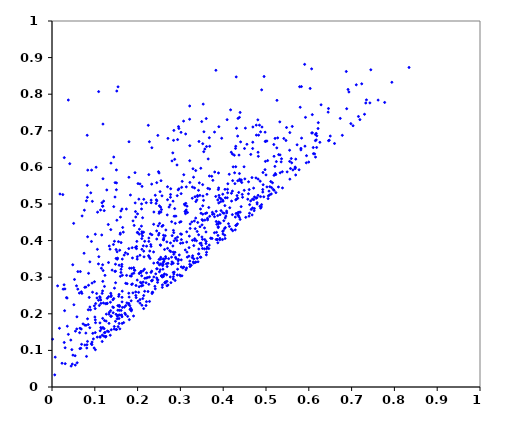
| Category | points |
|---|---|
| 0.14996600822938988 | 0.157 |
| 0.2538519331123644 | 0.387 |
| 0.33609830445176325 | 0.342 |
| 0.2009649696138185 | 0.556 |
| 0.10571911536144574 | 0.136 |
| 0.3006571428754381 | 0.304 |
| 0.09537257589368375 | 0.147 |
| 0.38746721742461077 | 0.394 |
| 0.5693814164976251 | 0.579 |
| 0.4378885634009636 | 0.583 |
| 0.5187987745960927 | 0.63 |
| 0.190539270114235 | 0.194 |
| 0.3620900134724797 | 0.526 |
| 0.2934849191602191 | 0.676 |
| 0.4574336012602498 | 0.513 |
| 0.22433203431825288 | 0.261 |
| 0.3522466488907272 | 0.665 |
| 0.23796214162603224 | 0.301 |
| 0.25100240692735687 | 0.315 |
| 0.028571211504298866 | 0.122 |
| 0.24729764003446741 | 0.687 |
| 0.4930083259814646 | 0.586 |
| 0.2342578447388438 | 0.259 |
| 0.296603717109026 | 0.541 |
| 0.231443041877467 | 0.384 |
| 0.09245658043074745 | 0.593 |
| 0.23806443718799575 | 0.478 |
| 0.25455858450280777 | 0.478 |
| 0.4979004457194802 | 0.696 |
| 0.08846284306278995 | 0.342 |
| 0.2317277293326614 | 0.504 |
| 0.5295581149846709 | 0.635 |
| 0.16304407737390536 | 0.329 |
| 0.5111018335146779 | 0.561 |
| 0.083589409945514 | 0.593 |
| 0.5182498111121585 | 0.663 |
| 0.3545333489110396 | 0.643 |
| 0.31477592328699033 | 0.424 |
| 0.33744879963457797 | 0.4 |
| 0.3758567424485221 | 0.565 |
| 0.4293126307478341 | 0.441 |
| 0.28228585160510244 | 0.64 |
| 0.513050007340022 | 0.545 |
| 0.2501905055678574 | 0.42 |
| 0.4875637987235829 | 0.489 |
| 0.36773824066127414 | 0.576 |
| 0.32776803869283433 | 0.516 |
| 0.20492507264218007 | 0.312 |
| 0.48210220283564686 | 0.63 |
| 0.49773014670859783 | 0.594 |
| 0.16109412726416128 | 0.481 |
| 0.27669788032085785 | 0.518 |
| 0.39953877044020825 | 0.418 |
| 0.17497784255116167 | 0.23 |
| 0.4925439163522779 | 0.533 |
| 0.3603654317188498 | 0.733 |
| 0.11160236608068308 | 0.247 |
| 0.7302109508781169 | 0.745 |
| 0.43092616774813464 | 0.442 |
| 0.02344858550452411 | 0.065 |
| 0.22850421948433952 | 0.371 |
| 0.3330610549169313 | 0.544 |
| 0.13378544964899042 | 0.385 |
| 0.258474266413254 | 0.332 |
| 0.5362997622574449 | 0.624 |
| 0.49487222072624837 | 0.52 |
| 0.12903134780387593 | 0.242 |
| 0.21333302386924358 | 0.386 |
| 0.48151889183177676 | 0.524 |
| 0.22682266937573414 | 0.356 |
| 0.3093470378987012 | 0.5 |
| 0.5827526713866171 | 0.821 |
| 0.538532206465129 | 0.544 |
| 0.24661332650902779 | 0.286 |
| 0.37976843125511794 | 0.697 |
| 0.007485824559324783 | 0.082 |
| 0.2955771497326545 | 0.711 |
| 0.2158642872986063 | 0.322 |
| 0.42215185414747014 | 0.427 |
| 0.4688089982400281 | 0.652 |
| 0.1543302035512688 | 0.82 |
| 0.08468084175842161 | 0.171 |
| 0.2036490996968927 | 0.418 |
| 0.14045098395075273 | 0.319 |
| 0.2852852743110823 | 0.399 |
| 0.4002132924881734 | 0.427 |
| 0.0936084434261304 | 0.284 |
| 0.3931002518734388 | 0.448 |
| 0.3797211094027986 | 0.465 |
| 0.16111927943620497 | 0.313 |
| 0.3405603657170908 | 0.45 |
| 0.43696282324866464 | 0.634 |
| 0.35033866737428676 | 0.41 |
| 0.6876360758077845 | 0.862 |
| 0.6174245048818664 | 0.693 |
| 0.4982516791558036 | 0.671 |
| 0.25777405396302344 | 0.272 |
| 0.5231506997926735 | 0.531 |
| 0.3527224671876258 | 0.522 |
| 0.6173569231581106 | 0.675 |
| 0.22019228114409128 | 0.298 |
| 0.14976805826960415 | 0.376 |
| 0.0173974376215017 | 0.16 |
| 0.18498840512994796 | 0.235 |
| 0.1580900879261301 | 0.197 |
| 0.24132429410757994 | 0.268 |
| 0.28355498085166175 | 0.301 |
| 0.14366126465856177 | 0.217 |
| 0.29287014407291445 | 0.306 |
| 0.6154292447277989 | 0.673 |
| 0.2920835279245402 | 0.607 |
| 0.06911182047724884 | 0.117 |
| 0.1532161205572694 | 0.352 |
| 0.4672547867016811 | 0.572 |
| 0.4644715333388355 | 0.636 |
| 0.529019307121444 | 0.547 |
| 0.28039796971519504 | 0.618 |
| 0.3228715466911438 | 0.445 |
| 0.43126287769595417 | 0.513 |
| 0.20795288796281441 | 0.313 |
| 0.32157086219975073 | 0.732 |
| 0.14425781829658146 | 0.493 |
| 0.4016710231272145 | 0.475 |
| 0.2447505099867191 | 0.558 |
| 0.2710457780135479 | 0.338 |
| 0.3219825589856614 | 0.659 |
| 0.11252656270175287 | 0.154 |
| 0.27736931408626286 | 0.542 |
| 0.09842685165032494 | 0.107 |
| 0.2556986117712693 | 0.304 |
| 0.479200768491052 | 0.504 |
| 0.3281291424017698 | 0.546 |
| 0.2793597857009733 | 0.355 |
| 0.22097326541977258 | 0.385 |
| 0.6135941921173391 | 0.637 |
| 0.13610744043025713 | 0.141 |
| 0.17153659098717455 | 0.367 |
| 0.24506375077403997 | 0.509 |
| 0.23291082793572537 | 0.554 |
| 0.05479270683521187 | 0.153 |
| 0.22625197883941073 | 0.58 |
| 0.13737673052646548 | 0.43 |
| 0.09426174301821844 | 0.507 |
| 0.5021937041778373 | 0.547 |
| 0.12266042160764046 | 0.182 |
| 0.3326297324584715 | 0.454 |
| 0.4714810104029723 | 0.512 |
| 0.028232498601921563 | 0.279 |
| 0.08043029554065495 | 0.509 |
| 0.14961586915919733 | 0.199 |
| 0.32175953229147447 | 0.335 |
| 0.2604247452192545 | 0.302 |
| 0.419213902729767 | 0.529 |
| 0.40818229762765934 | 0.476 |
| 0.3042243572430803 | 0.562 |
| 0.06828029336429553 | 0.158 |
| 0.48723723981365785 | 0.52 |
| 0.31282531266446845 | 0.32 |
| 0.11440353553556104 | 0.228 |
| 0.35230769089130043 | 0.472 |
| 0.1685655537288988 | 0.36 |
| 0.5997880061292808 | 0.615 |
| 0.4346457215725953 | 0.734 |
| 0.28039602401115915 | 0.342 |
| 0.5054807804196786 | 0.522 |
| 0.6478169687771119 | 0.674 |
| 0.36736946304772533 | 0.388 |
| 0.4772512473893231 | 0.715 |
| 0.5208517384615723 | 0.603 |
| 0.05724576740907816 | 0.276 |
| 0.08062820106371382 | 0.084 |
| 0.12504304918621445 | 0.137 |
| 0.15572866921925332 | 0.222 |
| 0.30743694176443837 | 0.727 |
| 0.4172912306206542 | 0.757 |
| 0.5242519457701105 | 0.616 |
| 0.3829316377470705 | 0.865 |
| 0.38843998831038906 | 0.438 |
| 0.13698011236676655 | 0.209 |
| 0.11912792564782515 | 0.569 |
| 0.2794023611807529 | 0.336 |
| 0.4340005783827058 | 0.516 |
| 0.27350201155900833 | 0.492 |
| 0.17698136404027542 | 0.363 |
| 0.28868271214233454 | 0.354 |
| 0.1840566293879804 | 0.215 |
| 0.16510093232706335 | 0.436 |
| 0.01308267904441518 | 0.276 |
| 0.09058693781296834 | 0.531 |
| 0.4376070116024632 | 0.464 |
| 0.09362233489698835 | 0.123 |
| 0.1595646197860877 | 0.42 |
| 0.6287059838826511 | 0.771 |
| 0.31135939913331945 | 0.374 |
| 0.6501108131502034 | 0.686 |
| 0.25067120514251573 | 0.479 |
| 0.20919753167975708 | 0.486 |
| 0.28394959755266747 | 0.674 |
| 0.21140311489142405 | 0.413 |
| 0.2080161411442779 | 0.316 |
| 0.4433617150965308 | 0.559 |
| 0.5038326898617792 | 0.619 |
| 0.34811610905790935 | 0.475 |
| 0.4641449592287379 | 0.508 |
| 0.20296332676292828 | 0.513 |
| 0.1957210581220219 | 0.464 |
| 0.06390591765095321 | 0.257 |
| 0.3476868413886317 | 0.598 |
| 0.10197468867908355 | 0.228 |
| 0.2334700322827058 | 0.416 |
| 0.6084431143728777 | 0.694 |
| 0.2094881632938792 | 0.304 |
| 0.27592715881438956 | 0.498 |
| 0.3549507202928982 | 0.697 |
| 0.2593723015995699 | 0.442 |
| 0.1295616087288911 | 0.153 |
| 0.1320796740414888 | 0.34 |
| 0.06845962870203526 | 0.26 |
| 0.364884546215414 | 0.623 |
| 0.4214309017788761 | 0.471 |
| 0.09201651659490417 | 0.118 |
| 0.5331562476351279 | 0.585 |
| 0.08475738611665096 | 0.211 |
| 0.4730805581709502 | 0.519 |
| 0.17241533181297974 | 0.222 |
| 0.36023496180439496 | 0.398 |
| 0.4518337660270668 | 0.707 |
| 0.2846387977249494 | 0.363 |
| 0.361120361771048 | 0.368 |
| 0.4452874862634767 | 0.518 |
| 0.26879860961329705 | 0.277 |
| 0.5211778549961676 | 0.679 |
| 0.2129570847619241 | 0.318 |
| 0.20596241145523064 | 0.229 |
| 0.3432199848959919 | 0.364 |
| 0.5590791300845208 | 0.624 |
| 0.4691452606533786 | 0.669 |
| 0.3731996318610822 | 0.576 |
| 0.19739563339635768 | 0.378 |
| 0.761980694556799 | 0.784 |
| 0.6452295133497216 | 0.751 |
| 0.11232485806975212 | 0.136 |
| 0.24458070741729754 | 0.426 |
| 0.22631642813980168 | 0.281 |
| 0.3641072732034668 | 0.543 |
| 0.20906521276242707 | 0.284 |
| 0.235247615220622 | 0.259 |
| 0.14348361660819908 | 0.389 |
| 0.5941369232376887 | 0.613 |
| 0.4350652028749128 | 0.469 |
| 0.15824381707817747 | 0.374 |
| 0.5252697020216937 | 0.653 |
| 0.24478119293845302 | 0.323 |
| 0.43958862570236357 | 0.75 |
| 0.4618119830830314 | 0.498 |
| 0.2983119808115534 | 0.45 |
| 0.3342562306116337 | 0.52 |
| 0.0063886593850018825 | 0.033 |
| 0.38364698297405 | 0.403 |
| 0.1576024847503824 | 0.22 |
| 0.27502847945359177 | 0.372 |
| 0.13153350374263317 | 0.444 |
| 0.26056606029987117 | 0.415 |
| 0.05057948929888145 | 0.447 |
| 0.20998507382748466 | 0.376 |
| 0.28831708511396037 | 0.406 |
| 0.35056721278842906 | 0.443 |
| 0.3469938590049556 | 0.486 |
| 0.12376653666409976 | 0.305 |
| 0.3402006754047566 | 0.521 |
| 0.7194317752357984 | 0.731 |
| 0.37945934179633545 | 0.421 |
| 0.29438938252933156 | 0.337 |
| 0.07660228223139565 | 0.272 |
| 0.03580133545353592 | 0.166 |
| 0.3301267047438732 | 0.342 |
| 0.06730623422265314 | 0.106 |
| 0.18532528828043215 | 0.208 |
| 0.20423892010926425 | 0.431 |
| 0.1094729437450983 | 0.356 |
| 0.3253264947978418 | 0.333 |
| 0.3144580994822833 | 0.325 |
| 0.5416970925704847 | 0.679 |
| 0.12655857845439056 | 0.18 |
| 0.2633459280482945 | 0.285 |
| 0.25379014971009106 | 0.491 |
| 0.5169542831014907 | 0.54 |
| 0.07495303001829534 | 0.365 |
| 0.5773474812402631 | 0.593 |
| 0.3357956243342285 | 0.591 |
| 0.2683598480587487 | 0.396 |
| 0.29543066070130153 | 0.349 |
| 0.3872638226470918 | 0.511 |
| 0.24666167293338448 | 0.34 |
| 0.22075791177724746 | 0.233 |
| 0.0651768204906168 | 0.105 |
| 0.1486014210730392 | 0.285 |
| 0.16143282993216002 | 0.322 |
| 0.18322663473175926 | 0.524 |
| 0.2672978166733986 | 0.337 |
| 0.12122038171832772 | 0.139 |
| 0.1523406125015202 | 0.187 |
| 0.2853662537118167 | 0.467 |
| 0.23261733491906345 | 0.29 |
| 0.4189158080845361 | 0.641 |
| 0.14597973760938743 | 0.27 |
| 0.18560638686497644 | 0.325 |
| 0.32684226188476573 | 0.451 |
| 0.10091476688532908 | 0.214 |
| 0.34238478872756306 | 0.364 |
| 0.693772982233414 | 0.806 |
| 0.2598513514002936 | 0.35 |
| 0.25807374932466365 | 0.279 |
| 0.22756306789214398 | 0.67 |
| 0.34550952327674334 | 0.524 |
| 0.48966367792814236 | 0.498 |
| 0.19942674318953257 | 0.422 |
| 0.3430702841113137 | 0.377 |
| 0.14828212822768783 | 0.336 |
| 0.12200410910706794 | 0.482 |
| 0.21429567623497026 | 0.371 |
| 0.35708443957018476 | 0.65 |
| 0.05881517094074873 | 0.066 |
| 0.8342433083506913 | 0.873 |
| 0.2692534086923667 | 0.47 |
| 0.07920242507526498 | 0.273 |
| 0.16422967904922958 | 0.349 |
| 0.40391769436403324 | 0.496 |
| 0.5726654162104712 | 0.662 |
| 0.3411798170969841 | 0.342 |
| 0.7236756091779756 | 0.828 |
| 0.4729133387976636 | 0.488 |
| 0.11909497089580012 | 0.718 |
| 0.14705557513076284 | 0.316 |
| 0.1599036444393439 | 0.464 |
| 0.39128907406741065 | 0.517 |
| 0.1504883064628758 | 0.593 |
| 0.3684762257365467 | 0.466 |
| 0.27002839765133857 | 0.379 |
| 0.2375077195956372 | 0.445 |
| 0.08293689246184699 | 0.125 |
| 0.18023554685684418 | 0.246 |
| 0.27626480312828305 | 0.301 |
| 0.5328639554902528 | 0.634 |
| 0.581674161233635 | 0.652 |
| 0.2540677211320439 | 0.354 |
| 0.5187492597638299 | 0.578 |
| 0.11541634354235675 | 0.324 |
| 0.05117214086648281 | 0.225 |
| 0.4283433063171409 | 0.464 |
| 0.2510047197223968 | 0.334 |
| 0.6982237720762111 | 0.72 |
| 0.21399411008084235 | 0.423 |
| 0.19628085057598732 | 0.277 |
| 0.21018697787987195 | 0.223 |
| 0.36635047869455917 | 0.378 |
| 0.4827119765310196 | 0.688 |
| 0.3615467097108007 | 0.476 |
| 0.3426428242016256 | 0.416 |
| 0.42666401360710104 | 0.585 |
| 0.04152207460777346 | 0.61 |
| 0.2334016387596407 | 0.29 |
| 0.11841607361993067 | 0.187 |
| 0.16274232879037553 | 0.197 |
| 0.23164843597954043 | 0.511 |
| 0.606760714277421 | 0.694 |
| 0.4864754017152786 | 0.562 |
| 0.3442068387769721 | 0.558 |
| 0.2725499226605924 | 0.351 |
| 0.09666676645989591 | 0.131 |
| 0.4592749306708722 | 0.561 |
| 0.2120300873543356 | 0.277 |
| 0.5599984316434743 | 0.613 |
| 0.6783316312325527 | 0.688 |
| 0.5558080922514009 | 0.568 |
| 0.20672744160412193 | 0.286 |
| 0.3003065626841468 | 0.393 |
| 0.35160020399052305 | 0.378 |
| 0.02945105671685111 | 0.209 |
| 0.3570729923090875 | 0.403 |
| 0.710997778712924 | 0.826 |
| 0.3675536903652151 | 0.681 |
| 0.14434152004141176 | 0.242 |
| 0.1483968887584457 | 0.316 |
| 0.07676335904566212 | 0.169 |
| 0.13560929833091573 | 0.377 |
| 0.22626289603668714 | 0.398 |
| 0.4770498493291323 | 0.516 |
| 0.49860651100117537 | 0.616 |
| 0.15159211290144115 | 0.456 |
| 0.23385505541869855 | 0.255 |
| 0.25467310476163973 | 0.564 |
| 0.01864660410457053 | 0.527 |
| 0.4232919605240424 | 0.602 |
| 0.03825110070807103 | 0.144 |
| 0.23455922502024473 | 0.292 |
| 0.22757321630760463 | 0.3 |
| 0.27103195657534684 | 0.279 |
| 0.2608427675831614 | 0.402 |
| 0.5552236989439608 | 0.616 |
| 0.17968935670063058 | 0.573 |
| 0.32254917592774424 | 0.329 |
| 0.40440351319429824 | 0.406 |
| 0.691708570550259 | 0.813 |
| 0.1474736578494028 | 0.558 |
| 0.16350016563243086 | 0.192 |
| 0.38512293150271426 | 0.445 |
| 0.43038933539453295 | 0.847 |
| 0.26112449509410396 | 0.407 |
| 0.484745182552237 | 0.715 |
| 0.44981765326312295 | 0.652 |
| 0.15935189422096718 | 0.417 |
| 0.1201008222639226 | 0.23 |
| 0.3633397482591113 | 0.461 |
| 0.1806693849227261 | 0.184 |
| 0.3384951067588299 | 0.511 |
| 0.26299504878478663 | 0.376 |
| 0.3350117235784734 | 0.341 |
| 0.3890038813212391 | 0.585 |
| 0.3989310292200353 | 0.51 |
| 0.048968313528171215 | 0.087 |
| 0.44193265559425443 | 0.493 |
| 0.10429298863210357 | 0.255 |
| 0.19358539985242262 | 0.319 |
| 0.48908803771225906 | 0.492 |
| 0.5217463253359915 | 0.583 |
| 0.03021514827992189 | 0.268 |
| 0.25975420766289137 | 0.335 |
| 0.17994571782627966 | 0.67 |
| 0.4898162114210304 | 0.812 |
| 0.35405639948600875 | 0.51 |
| 0.16662520430008632 | 0.423 |
| 0.33620643747792545 | 0.507 |
| 0.38259801535964666 | 0.521 |
| 0.3023120707745436 | 0.403 |
| 0.733155076366055 | 0.776 |
| 0.12253664539895315 | 0.148 |
| 0.435135545850313 | 0.477 |
| 0.1859907489386372 | 0.211 |
| 0.1568395304388036 | 0.333 |
| 0.11874270506681728 | 0.289 |
| 0.578609288204905 | 0.82 |
| 0.13221461502868992 | 0.247 |
| 0.24901379921277456 | 0.415 |
| 0.461388358667118 | 0.475 |
| 0.265050539099422 | 0.287 |
| 0.15078843986155044 | 0.157 |
| 0.39500181208373464 | 0.482 |
| 0.19933650662967717 | 0.356 |
| 0.13389959469095924 | 0.204 |
| 0.5799170528881848 | 0.764 |
| 0.28068157933447346 | 0.414 |
| 0.36102975183550357 | 0.657 |
| 0.3837382745352248 | 0.48 |
| 0.2646567701064235 | 0.413 |
| 0.07946962364929555 | 0.169 |
| 0.40407806250596845 | 0.54 |
| 0.2597622526068304 | 0.34 |
| 0.439524558004188 | 0.458 |
| 0.2834366358418756 | 0.313 |
| 0.2934478964636321 | 0.322 |
| 0.18796869037740793 | 0.353 |
| 0.2539532714604663 | 0.336 |
| 0.0013390045108441218 | 0.131 |
| 0.1423996226553782 | 0.238 |
| 0.469387145657274 | 0.71 |
| 0.5256270208597922 | 0.783 |
| 0.06994864566643122 | 0.256 |
| 0.4906498383322091 | 0.71 |
| 0.2832530125283296 | 0.338 |
| 0.16441404174272123 | 0.217 |
| 0.515123348008718 | 0.558 |
| 0.34655393211335994 | 0.355 |
| 0.2298182978397788 | 0.418 |
| 0.434993018982469 | 0.468 |
| 0.3395573160468499 | 0.351 |
| 0.09471651042537166 | 0.259 |
| 0.1557872544290715 | 0.248 |
| 0.4293076389107603 | 0.602 |
| 0.13835078282686808 | 0.251 |
| 0.41087920818017243 | 0.555 |
| 0.1120790425008924 | 0.175 |
| 0.4273922984350975 | 0.556 |
| 0.04638308761324561 | 0.102 |
| 0.31269695898096084 | 0.502 |
| 0.11403634856330047 | 0.162 |
| 0.35627271697519725 | 0.378 |
| 0.4765809065486014 | 0.571 |
| 0.20007532100019276 | 0.422 |
| 0.387762384388894 | 0.414 |
| 0.24131908192933693 | 0.524 |
| 0.3990117953127813 | 0.527 |
| 0.17425578254053864 | 0.305 |
| 0.42932154127232036 | 0.658 |
| 0.6461051514162804 | 0.673 |
| 0.10899507416641652 | 0.807 |
| 0.089880569889498 | 0.211 |
| 0.1637006603380381 | 0.245 |
| 0.3571174791859122 | 0.456 |
| 0.18232903719368954 | 0.212 |
| 0.1951059449160183 | 0.381 |
| 0.3626892165356409 | 0.382 |
| 0.7940995016159771 | 0.833 |
| 0.07254557457638777 | 0.172 |
| 0.43714056238464916 | 0.478 |
| 0.3884419963202179 | 0.447 |
| 0.32171727629554836 | 0.768 |
| 0.20987030994016265 | 0.419 |
| 0.5272670513877347 | 0.681 |
| 0.37472715740397733 | 0.477 |
| 0.31554512178172733 | 0.494 |
| 0.08138064304889492 | 0.107 |
| 0.33997649377350925 | 0.523 |
| 0.645924487285831 | 0.761 |
| 0.26862285844169675 | 0.289 |
| 0.5556981236841183 | 0.695 |
| 0.20977684500725868 | 0.405 |
| 0.1139025767672256 | 0.238 |
| 0.1379783106636896 | 0.247 |
| 0.396472190515581 | 0.68 |
| 0.34840403665536035 | 0.393 |
| 0.12418167929406554 | 0.149 |
| 0.1553283043365673 | 0.397 |
| 0.26015058919206924 | 0.402 |
| 0.25271469992468354 | 0.32 |
| 0.6187506121599362 | 0.687 |
| 0.25384131648549924 | 0.349 |
| 0.3056297052004716 | 0.394 |
| 0.3663143704467787 | 0.49 |
| 0.33132464586457555 | 0.35 |
| 0.044677659633771905 | 0.057 |
| 0.10850925167927872 | 0.336 |
| 0.404990053616224 | 0.436 |
| 0.37150499386847013 | 0.407 |
| 0.4140959107764788 | 0.581 |
| 0.48169651946612446 | 0.568 |
| 0.1955792627295695 | 0.26 |
| 0.47874648014400256 | 0.517 |
| 0.05448934707407027 | 0.06 |
| 0.34579254874835075 | 0.438 |
| 0.3282313075837874 | 0.401 |
| 0.21646944060363382 | 0.261 |
| 0.39196211368208833 | 0.402 |
| 0.14291580838065354 | 0.203 |
| 0.6156845102466454 | 0.628 |
| 0.18730274813166203 | 0.309 |
| 0.5922717681237832 | 0.737 |
| 0.3925190714966119 | 0.471 |
| 0.08171549445676884 | 0.115 |
| 0.25576146671009814 | 0.485 |
| 0.7159845122565178 | 0.739 |
| 0.30150844885289796 | 0.696 |
| 0.17677065966111616 | 0.193 |
| 0.10873304940868 | 0.237 |
| 0.32774445378171035 | 0.354 |
| 0.15457319252040702 | 0.196 |
| 0.10603695613158348 | 0.376 |
| 0.03083177207560106 | 0.064 |
| 0.331291403988221 | 0.386 |
| 0.1991265916669358 | 0.349 |
| 0.3596209492454696 | 0.392 |
| 0.2056655120907147 | 0.239 |
| 0.34229639331722095 | 0.537 |
| 0.37845801009589075 | 0.472 |
| 0.4873361552538813 | 0.697 |
| 0.10120848736863897 | 0.417 |
| 0.4341018131465745 | 0.563 |
| 0.3120321920666781 | 0.474 |
| 0.20926857336300275 | 0.5 |
| 0.2653935979178076 | 0.356 |
| 0.10121277044561039 | 0.183 |
| 0.2617525688765554 | 0.344 |
| 0.42211922996312656 | 0.564 |
| 0.15979904848343573 | 0.302 |
| 0.34979139423974737 | 0.725 |
| 0.2894702786477199 | 0.467 |
| 0.2845057860533404 | 0.422 |
| 0.11674571781536502 | 0.503 |
| 0.2866936808819418 | 0.622 |
| 0.15663136428483293 | 0.253 |
| 0.05399550396470243 | 0.085 |
| 0.14433045057381044 | 0.628 |
| 0.5695501289381085 | 0.623 |
| 0.4049862810763899 | 0.517 |
| 0.1017460904589037 | 0.176 |
| 0.3347075905936713 | 0.433 |
| 0.0307041840750486 | 0.107 |
| 0.21013209055310056 | 0.424 |
| 0.18910822111061742 | 0.257 |
| 0.7034344759949794 | 0.714 |
| 0.3895336705103788 | 0.451 |
| 0.4590001060067672 | 0.528 |
| 0.13335020036444012 | 0.199 |
| 0.2502412244003478 | 0.349 |
| 0.1909134998082791 | 0.326 |
| 0.3683249136062554 | 0.658 |
| 0.2292273949673943 | 0.351 |
| 0.22503680422294303 | 0.715 |
| 0.3021335797942234 | 0.328 |
| 0.3982832607418978 | 0.403 |
| 0.17221927354330713 | 0.283 |
| 0.2876633375056932 | 0.291 |
| 0.15851015111154576 | 0.159 |
| 0.48583628392833644 | 0.494 |
| 0.1919339824246742 | 0.441 |
| 0.3477857872832215 | 0.354 |
| 0.32869220028402746 | 0.358 |
| 0.29320107129274675 | 0.409 |
| 0.20562114037753887 | 0.555 |
| 0.358394334428635 | 0.474 |
| 0.15381183985902658 | 0.222 |
| 0.29260908723198986 | 0.523 |
| 0.47107018067573236 | 0.543 |
| 0.038152099277669826 | 0.784 |
| 0.12608666677867209 | 0.138 |
| 0.025332769800192056 | 0.526 |
| 0.2555828696717929 | 0.303 |
| 0.4955341481930451 | 0.848 |
| 0.45272810906965655 | 0.464 |
| 0.11265268432686382 | 0.244 |
| 0.44873069418120315 | 0.602 |
| 0.4259949902476181 | 0.633 |
| 0.28663960382319575 | 0.487 |
| 0.3457683388797974 | 0.392 |
| 0.12890467086655655 | 0.229 |
| 0.4792946583647488 | 0.5 |
| 0.49952894591522246 | 0.672 |
| 0.3135702883830307 | 0.484 |
| 0.32213703968797236 | 0.559 |
| 0.6222009058445407 | 0.722 |
| 0.42935049544072335 | 0.511 |
| 0.07034868062606281 | 0.467 |
| 0.3506035888467043 | 0.457 |
| 0.11625567660355496 | 0.415 |
| 0.19986108591176055 | 0.473 |
| 0.351657186742675 | 0.403 |
| 0.5466450573490869 | 0.674 |
| 0.16746816013431898 | 0.176 |
| 0.6081779640933145 | 0.744 |
| 0.11347796478781957 | 0.484 |
| 0.2569860451954681 | 0.522 |
| 0.21657404745494824 | 0.398 |
| 0.32943369620849716 | 0.596 |
| 0.18127567373468167 | 0.325 |
| 0.06449467614401361 | 0.148 |
| 0.13224901129821987 | 0.151 |
| 0.32086506998686315 | 0.412 |
| 0.21963508485132144 | 0.223 |
| 0.6154583762344452 | 0.69 |
| 0.2257038211317557 | 0.359 |
| 0.10513306195761751 | 0.243 |
| 0.31087813923401086 | 0.497 |
| 0.02869625190614078 | 0.627 |
| 0.04854465920106421 | 0.334 |
| 0.37500559532426603 | 0.472 |
| 0.5070370976693869 | 0.535 |
| 0.16410133959322692 | 0.262 |
| 0.15439259686686457 | 0.165 |
| 0.5830958828328001 | 0.68 |
| 0.19508827554238317 | 0.479 |
| 0.18604048891401914 | 0.28 |
| 0.49236744820570777 | 0.54 |
| 0.0992239190822296 | 0.288 |
| 0.2779151191405753 | 0.285 |
| 0.24552769187896206 | 0.323 |
| 0.39901323319026794 | 0.425 |
| 0.33918216868661377 | 0.425 |
| 0.4124073096823808 | 0.446 |
| 0.2691373187150472 | 0.329 |
| 0.14188833799033163 | 0.219 |
| 0.2629290956403444 | 0.309 |
| 0.3532708617820709 | 0.773 |
| 0.38864166688437085 | 0.539 |
| 0.5228691855030855 | 0.58 |
| 0.1064690828562529 | 0.478 |
| 0.5946645434489024 | 0.632 |
| 0.3496873072513167 | 0.387 |
| 0.1966760554792013 | 0.244 |
| 0.43311741892881694 | 0.475 |
| 0.606583532164941 | 0.869 |
| 0.08224011818400923 | 0.688 |
| 0.20554470524267054 | 0.36 |
| 0.187822595213183 | 0.282 |
| 0.2709418924126634 | 0.679 |
| 0.26605654498040565 | 0.429 |
| 0.3311659927867584 | 0.339 |
| 0.3895156721858428 | 0.503 |
| 0.06546824409477159 | 0.161 |
| 0.24874455269061335 | 0.588 |
| 0.03532610995209484 | 0.243 |
| 0.5322767350862597 | 0.724 |
| 0.21036610102581055 | 0.548 |
| 0.22631175060110564 | 0.407 |
| 0.3020282768139345 | 0.347 |
| 0.4048346686657661 | 0.462 |
| 0.2847192120345169 | 0.701 |
| 0.08700509522369693 | 0.245 |
| 0.057913952748300135 | 0.159 |
| 0.5680863772647806 | 0.601 |
| 0.1172579271123001 | 0.124 |
| 0.3078590219176375 | 0.328 |
| 0.17940065869738853 | 0.378 |
| 0.08250354846220487 | 0.551 |
| 0.4037092354679571 | 0.415 |
| 0.12062825389104659 | 0.508 |
| 0.03388373681288781 | 0.244 |
| 0.31235048503818197 | 0.48 |
| 0.1269447592227433 | 0.199 |
| 0.1538282185635731 | 0.21 |
| 0.38588303519417366 | 0.403 |
| 0.38939932592952375 | 0.544 |
| 0.2899857207679154 | 0.351 |
| 0.2974081426798697 | 0.361 |
| 0.1737837233360794 | 0.486 |
| 0.02600022736482388 | 0.267 |
| 0.11884892624725207 | 0.494 |
| 0.2918824924541299 | 0.4 |
| 0.13847398364447772 | 0.156 |
| 0.5613658596347966 | 0.712 |
| 0.17027565204052453 | 0.202 |
| 0.2767850362084263 | 0.394 |
| 0.4378937815395606 | 0.737 |
| 0.181928560216292 | 0.222 |
| 0.1372899265474089 | 0.256 |
| 0.3217949331600194 | 0.618 |
| 0.7449332263348142 | 0.867 |
| 0.25302429679121907 | 0.388 |
| 0.44913592519084555 | 0.537 |
| 0.07563642907499746 | 0.483 |
| 0.43626396006232004 | 0.532 |
| 0.22026759896463222 | 0.504 |
| 0.3522217823166771 | 0.495 |
| 0.2656684186893443 | 0.352 |
| 0.1451497471205777 | 0.158 |
| 0.618311200354955 | 0.654 |
| 0.25029138159549846 | 0.475 |
| 0.40147029934646505 | 0.454 |
| 0.15754304735958657 | 0.223 |
| 0.31661093417662123 | 0.477 |
| 0.11831988946919714 | 0.334 |
| 0.4300555460564526 | 0.474 |
| 0.41454438338794 | 0.439 |
| 0.29846222384642385 | 0.306 |
| 0.32027781845636216 | 0.381 |
| 0.15235401749101107 | 0.349 |
| 0.103056911532586 | 0.6 |
| 0.2508265763770038 | 0.495 |
| 0.2329791383435741 | 0.316 |
| 0.2600874391370467 | 0.306 |
| 0.3890137843628254 | 0.446 |
| 0.24389548141345263 | 0.511 |
| 0.3635359474217227 | 0.457 |
| 0.4100627723957103 | 0.54 |
| 0.28482031515023987 | 0.308 |
| 0.25253382489697473 | 0.534 |
| 0.27953085556500146 | 0.452 |
| 0.4189895570038973 | 0.431 |
| 0.17941965081987743 | 0.256 |
| 0.2773308018918339 | 0.37 |
| 0.5082657773416122 | 0.525 |
| 0.04746925465947549 | 0.063 |
| 0.30038812463794407 | 0.418 |
| 0.2591849281126827 | 0.322 |
| 0.38017225498035 | 0.587 |
| 0.12497411022552496 | 0.228 |
| 0.2948966445108794 | 0.345 |
| 0.24799459215159791 | 0.44 |
| 0.5000327906559467 | 0.579 |
| 0.19585786441285635 | 0.25 |
| 0.30175227141676453 | 0.528 |
| 0.18547339433358667 | 0.303 |
| 0.18928724656663576 | 0.454 |
| 0.5685118676052335 | 0.599 |
| 0.5354186122702425 | 0.615 |
| 0.2699333039318993 | 0.547 |
| 0.7347423115588081 | 0.785 |
| 0.5551783774554494 | 0.647 |
| 0.431103199408606 | 0.707 |
| 0.45061950740211276 | 0.569 |
| 0.08836475472485483 | 0.162 |
| 0.4079592255766923 | 0.481 |
| 0.23771861778216352 | 0.338 |
| 0.2828434075880337 | 0.508 |
| 0.09215920366968611 | 0.398 |
| 0.3922191717700283 | 0.406 |
| 0.265207577849074 | 0.284 |
| 0.24317838514180568 | 0.502 |
| 0.13645639540192178 | 0.232 |
| 0.1387712704748808 | 0.193 |
| 0.13781359491529455 | 0.612 |
| 0.14973138039295686 | 0.351 |
| 0.044010281716402866 | 0.128 |
| 0.28555728019254734 | 0.314 |
| 0.30791729105623644 | 0.58 |
| 0.15736609978374372 | 0.21 |
| 0.0932832129625254 | 0.116 |
| 0.23734847077718702 | 0.369 |
| 0.19823524257692327 | 0.398 |
| 0.3837140631510868 | 0.452 |
| 0.3860831761563437 | 0.403 |
| 0.47227385431802005 | 0.482 |
| 0.3940017792754823 | 0.506 |
| 0.08851521757244973 | 0.218 |
| 0.5021131962048613 | 0.672 |
| 0.1873415642143771 | 0.381 |
| 0.47761560750518217 | 0.688 |
| 0.2023715064261855 | 0.259 |
| 0.6031930409856893 | 0.816 |
| 0.2010954788334932 | 0.234 |
| 0.16319995627657535 | 0.335 |
| 0.24038750902776673 | 0.275 |
| 0.3307687319836634 | 0.573 |
| 0.6103920083858511 | 0.654 |
| 0.509008472486593 | 0.547 |
| 0.3434440947832109 | 0.671 |
| 0.1013703453922633 | 0.102 |
| 0.23334471795856926 | 0.654 |
| 0.3949415779754426 | 0.514 |
| 0.11819469799686755 | 0.263 |
| 0.5679791345090535 | 0.597 |
| 0.18269736777354395 | 0.303 |
| 0.16366110580302284 | 0.233 |
| 0.6735163375845157 | 0.734 |
| 0.5124050054862767 | 0.527 |
| 0.17197348063972206 | 0.198 |
| 0.2501980236166046 | 0.585 |
| 0.10020981629240666 | 0.191 |
| 0.3107768750711375 | 0.479 |
| 0.3122703883333451 | 0.691 |
| 0.5381168813495256 | 0.588 |
| 0.36058372019390994 | 0.361 |
| 0.17929268504709606 | 0.226 |
| 0.2130709876409994 | 0.287 |
| 0.25763624741125035 | 0.301 |
| 0.11238250453755205 | 0.138 |
| 0.152201986217242 | 0.369 |
| 0.1913025126058565 | 0.311 |
| 0.7772524273664203 | 0.777 |
| 0.32281096197727954 | 0.433 |
| 0.3884580204180552 | 0.436 |
| 0.3708664911323193 | 0.406 |
| 0.3598242109572265 | 0.424 |
| 0.36838799949446577 | 0.541 |
| 0.2872749052654944 | 0.368 |
| 0.37404604267863073 | 0.406 |
| 0.07680054780114398 | 0.115 |
| 0.6216677983712277 | 0.706 |
| 0.3029919153939692 | 0.546 |
| 0.214439960434761 | 0.513 |
| 0.163581723269709 | 0.486 |
| 0.11903217566435531 | 0.162 |
| 0.7428000934320214 | 0.776 |
| 0.15141548455693943 | 0.809 |
| 0.4809670895685846 | 0.73 |
| 0.16442130873991745 | 0.305 |
| 0.2678522621587025 | 0.307 |
| 0.4686360047018139 | 0.489 |
| 0.31380016984185366 | 0.547 |
| 0.4195592929248201 | 0.508 |
| 0.052579278749652736 | 0.294 |
| 0.6601141518622716 | 0.665 |
| 0.3331325873479053 | 0.401 |
| 0.14830863020387064 | 0.179 |
| 0.24756861726902413 | 0.293 |
| 0.40614326747047125 | 0.467 |
| 0.36125829532106923 | 0.378 |
| 0.4653622487396474 | 0.485 |
| 0.24738167184646476 | 0.34 |
| 0.4554157820743391 | 0.663 |
| 0.28334784715780326 | 0.295 |
| 0.06623356506094924 | 0.315 |
| 0.1943533108018436 | 0.503 |
| 0.27700281226706636 | 0.526 |
| 0.11716139840748019 | 0.256 |
| 0.428187588287285 | 0.429 |
| 0.0604339183088215 | 0.315 |
| 0.467596145366045 | 0.47 |
| 0.12177293559997926 | 0.159 |
| 0.15685094650587494 | 0.174 |
| 0.4216599056220879 | 0.636 |
| 0.42879348228476133 | 0.652 |
| 0.3025892369920521 | 0.417 |
| 0.22325155700853305 | 0.299 |
| 0.21500038401248356 | 0.356 |
| 0.4424840247371452 | 0.566 |
| 0.6108540474442556 | 0.638 |
| 0.20876125860761385 | 0.276 |
| 0.43378982279059064 | 0.686 |
| 0.1472506550189605 | 0.519 |
| 0.3059672506869787 | 0.325 |
| 0.26130253056156283 | 0.349 |
| 0.31608565747167805 | 0.355 |
| 0.3036173957572007 | 0.304 |
| 0.11827190174147595 | 0.494 |
| 0.06030968922416935 | 0.267 |
| 0.3522302840434922 | 0.455 |
| 0.44452895826130245 | 0.526 |
| 0.2314064531341431 | 0.313 |
| 0.46845438012731966 | 0.513 |
| 0.19909002116137187 | 0.292 |
| 0.35203229473172537 | 0.553 |
| 0.3563577853056674 | 0.435 |
| 0.29468887887319895 | 0.539 |
| 0.4323521533688134 | 0.523 |
| 0.20896944797933348 | 0.44 |
| 0.1194757045742495 | 0.318 |
| 0.4397026325500685 | 0.478 |
| 0.21977535894304134 | 0.285 |
| 0.6885269172781382 | 0.76 |
| 0.14557233507945666 | 0.165 |
| 0.3898576963536251 | 0.711 |
| 0.1614191815594942 | 0.395 |
| 0.2833099494494081 | 0.368 |
| 0.5048807822732723 | 0.515 |
| 0.1331927868081113 | 0.174 |
| 0.25694519802872295 | 0.439 |
| 0.0791126597484254 | 0.147 |
| 0.12805469537739056 | 0.538 |
| 0.5902747337753058 | 0.882 |
| 0.44017320188028397 | 0.563 |
| 0.4032104906293944 | 0.433 |
| 0.2964288407644724 | 0.706 |
| 0.2122094991535809 | 0.242 |
| 0.40916136735770137 | 0.73 |
| 0.5494259644311905 | 0.588 |
| 0.21425146323925692 | 0.25 |
| 0.1615368823178489 | 0.209 |
| 0.48150424339663733 | 0.641 |
| 0.14588952978449987 | 0.398 |
| 0.6259014659826101 | 0.669 |
| 0.1755296900240093 | 0.282 |
| 0.5479827971863955 | 0.709 |
| 0.24243860884259116 | 0.309 |
| 0.1525918319638514 | 0.194 |
| 0.5189807978096704 | 0.537 |
| 0.11760416071927027 | 0.142 |
| 0.5629190793244176 | 0.593 |
| 0.3870584516130815 | 0.468 |
| 0.24480204734952082 | 0.404 |
| 0.46035165199534545 | 0.467 |
| 0.3198950924692604 | 0.357 |
| 0.10105829202882721 | 0.149 |
| 0.4153840392775754 | 0.49 |
| 0.5910491324674704 | 0.658 |
| 0.08270123074810987 | 0.518 |
| 0.433293703264538 | 0.446 |
| 0.39961031469071806 | 0.508 |
| 0.0582316470533748 | 0.192 |
| 0.28807389568298003 | 0.447 |
| 0.1154268017641441 | 0.159 |
| 0.32201281604315946 | 0.344 |
| 0.19394597415433024 | 0.586 |
| 0.09894547648264251 | 0.222 |
| 0.4933485999270929 | 0.553 |
| 0.21419407825343317 | 0.214 |
| 0.16388112386190679 | 0.174 |
| 0.3012636603278619 | 0.452 |
| 0.43836869221054275 | 0.568 |
| 0.3335625351354351 | 0.405 |
| 0.1506497729568873 | 0.558 |
| 0.19228642269781548 | 0.319 |
| 0.39017144317341423 | 0.524 |
| 0.557246383744104 | 0.597 |
| 0.2038554787024628 | 0.31 |
| 0.21173263784459062 | 0.462 |
| 0.3989678550146748 | 0.476 |
| 0.1565987369131402 | 0.187 |
| 0.4406472204879417 | 0.67 |
| 0.4607284866545781 | 0.539 |
| 0.22791961366419478 | 0.234 |
| 0.21692040878313223 | 0.297 |
| 0.26990609189321324 | 0.512 |
| 0.20366124723908097 | 0.274 |
| 0.23074693318525774 | 0.389 |
| 0.08544541991202992 | 0.311 |
| 0.16912242151926782 | 0.218 |
| 0.08540052140133048 | 0.278 |
| 0.3147539946130017 | 0.396 |
| 0.08306379706456901 | 0.186 |
| 0.4094209612995616 | 0.517 |
| 0.15042922004802284 | 0.539 |
| 0.1373088481892255 | 0.193 |
| 0.24480428224130601 | 0.298 |
| 0.246332488411673 | 0.293 |
| 0.33577130501802044 | 0.461 |
| 0.11059806322625054 | 0.223 |
| 0.08320898008746502 | 0.41 |
| 0.12259327558889477 | 0.275 |
| 0.12828461093970633 | 0.227 |
| 0.3844199226968368 | 0.423 |
| 0.3154182770541797 | 0.368 |
| 0.19745238310652102 | 0.384 |
| 0.2209501711506202 | 0.312 |
| 0.4104187321962047 | 0.531 |
| 0.2513266017458181 | 0.447 |
| 0.1794926242800874 | 0.228 |
| 0.28370373412583716 | 0.428 |
| 0.42154522456285104 | 0.535 |
| 0.2824202661791392 | 0.385 |
| 0.5815474730214828 | 0.648 |